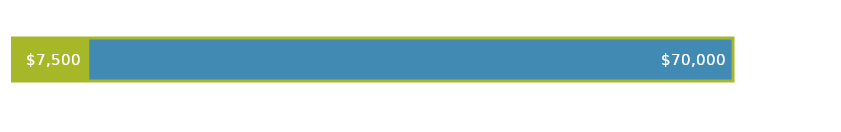
| Category | FINANZIERUNG INSGESAMT | GESAMTAUSGABEN |
|---|---|---|
| 0 | 70000 | 7500 |